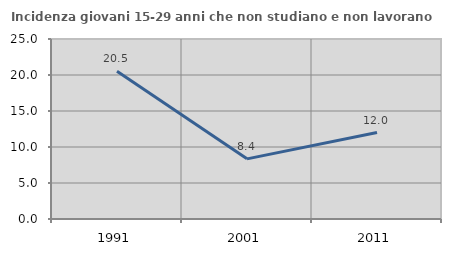
| Category | Incidenza giovani 15-29 anni che non studiano e non lavorano  |
|---|---|
| 1991.0 | 20.522 |
| 2001.0 | 8.353 |
| 2011.0 | 12.012 |